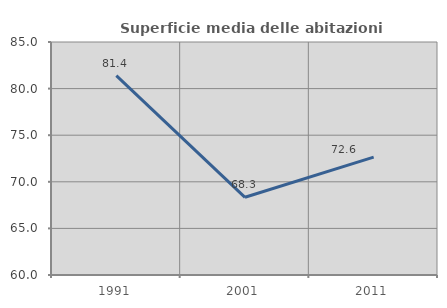
| Category | Superficie media delle abitazioni occupate |
|---|---|
| 1991.0 | 81.387 |
| 2001.0 | 68.338 |
| 2011.0 | 72.648 |